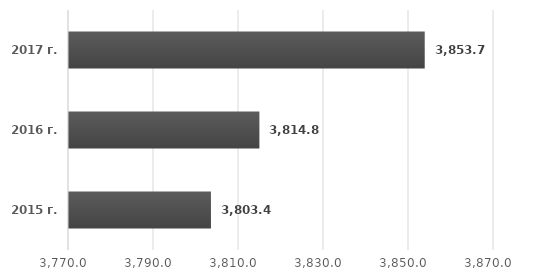
| Category | Series 0 |
|---|---|
| 2015 г. | 3803.4 |
| 2016 г. | 3814.8 |
| 2017 г. | 3853.7 |